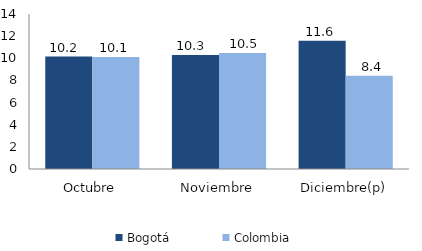
| Category | Bogotá | Colombia |
|---|---|---|
| Octubre | 10.157 | 10.113 |
| Noviembre | 10.289 | 10.476 |
| Diciembre(p) | 11.58 | 8.429 |